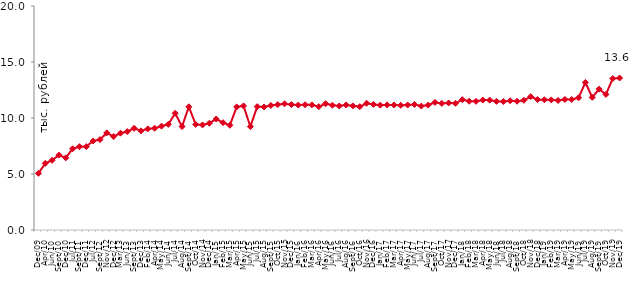
| Category | медианное значение среднедушевого располагаемого дохода, тыс. руб. |
|---|---|
| 2009-12-01 | 5.058 |
| 2010-04-01 | 5.949 |
| 2010-06-01 | 6.224 |
| 2010-09-01 | 6.686 |
| 2010-12-01 | 6.44 |
| 2011-07-01 | 7.25 |
| 2011-09-01 | 7.441 |
| 2011-12-01 | 7.446 |
| 2012-07-01 | 7.95 |
| 2012-09-01 | 8.071 |
| 2012-11-01 | 8.673 |
| 2012-12-01 | 8.345 |
| 2013-03-01 | 8.644 |
| 2013-06-01 | 8.789 |
| 2013-09-01 | 9.079 |
| 2013-12-01 | 8.849 |
| 2014-02-01 | 9.025 |
| 2014-04-01 | 9.087 |
| 2014-05-01 | 9.273 |
| 2014-06-01 | 9.432 |
| 2014-07-01 | 10.422 |
| 2014-08-01 | 9.241 |
| 2014-09-01 | 11 |
| 2014-10-01 | 9.426 |
| 2014-11-01 | 9.381 |
| 2014-12-01 | 9.532 |
| 2015-01-01 | 9.908 |
| 2015-02-01 | 9.585 |
| 2015-03-01 | 9.35 |
| 2015-04-01 | 10.991 |
| 2015-05-01 | 11.076 |
| 2015-06-01 | 9.237 |
| 2015-07-01 | 11.013 |
| 2015-08-01 | 10.981 |
| 2015-09-01 | 11.124 |
| 2015-10-01 | 11.195 |
| 2015-11-01 | 11.268 |
| 2015-12-01 | 11.194 |
| 2016-01-01 | 11.158 |
| 2016-02-01 | 11.188 |
| 2016-03-01 | 11.174 |
| 2016-04-01 | 11.01 |
| 2016-05-01 | 11.278 |
| 2016-06-01 | 11.142 |
| 2016-07-01 | 11.072 |
| 2016-08-01 | 11.165 |
| 2016-09-01 | 11.082 |
| 2016-10-01 | 11.008 |
| 2016-11-01 | 11.313 |
| 2016-12-01 | 11.216 |
| 2017-01-01 | 11.146 |
| 2017-02-01 | 11.17 |
| 2017-03-01 | 11.162 |
| 2017-04-01 | 11.133 |
| 2017-05-01 | 11.163 |
| 2017-06-01 | 11.207 |
| 2017-07-01 | 11.066 |
| 2017-08-01 | 11.153 |
| 2017-09-01 | 11.395 |
| 2017-10-01 | 11.301 |
| 2017-11-01 | 11.342 |
| 2017-12-01 | 11.31 |
| 2018-01-01 | 11.637 |
| 2018-02-01 | 11.497 |
| 2018-03-01 | 11.49 |
| 2018-04-01 | 11.601 |
| 2018-05-01 | 11.592 |
| 2018-06-01 | 11.491 |
| 2018-07-01 | 11.471 |
| 2018-08-01 | 11.541 |
| 2018-09-01 | 11.497 |
| 2018-10-01 | 11.578 |
| 2018-11-01 | 11.906 |
| 2018-12-01 | 11.648 |
| 2019-01-01 | 11.629 |
| 2019-02-01 | 11.617 |
| 2019-03-01 | 11.566 |
| 2019-04-01 | 11.659 |
| 2019-05-01 | 11.653 |
| 2019-06-01 | 11.805 |
| 2019-07-01 | 13.174 |
| 2019-08-01 | 11.844 |
| 2019-09-01 | 12.577 |
| 2019-10-01 | 12.107 |
| 2019-11-01 | 13.523 |
| 2019-12-01 | 13.573 |